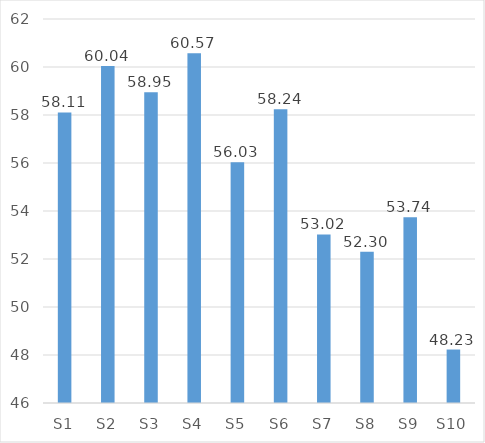
| Category | Mean |
|---|---|
| S1 | 58.106 |
| S2 | 60.037 |
| S3 | 58.952 |
| S4 | 60.57 |
| S5 | 56.031 |
| S6 | 58.239 |
| S7 | 53.024 |
| S8 | 52.305 |
| S9 | 53.742 |
| S10 | 48.228 |